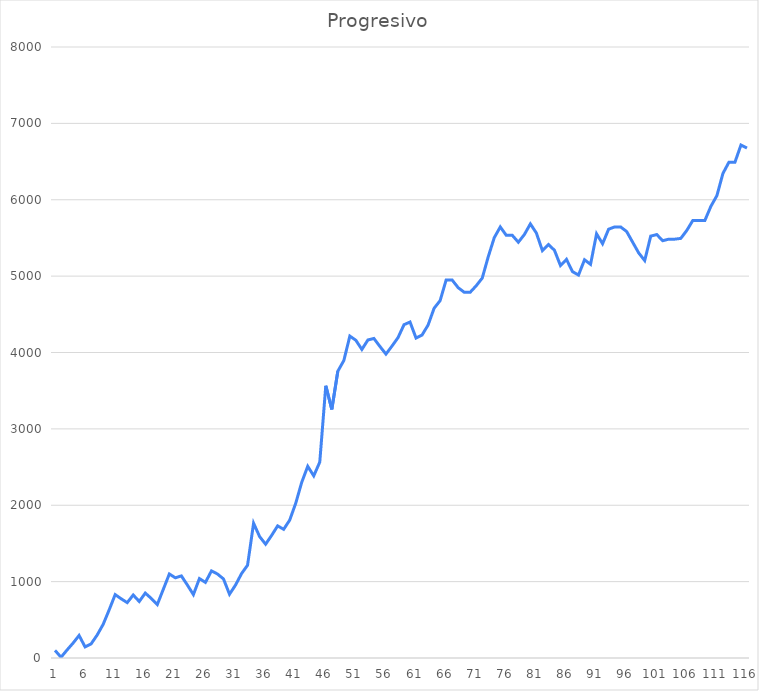
| Category | Series 0 |
|---|---|
| 0 | 100 |
| 1 | 10 |
| 2 | 105 |
| 3 | 195 |
| 4 | 295 |
| 5 | 145 |
| 6 | 185 |
| 7 | 300 |
| 8 | 440 |
| 9 | 630 |
| 10 | 830 |
| 11 | 775 |
| 12 | 725 |
| 13 | 825 |
| 14 | 740 |
| 15 | 850 |
| 16 | 780 |
| 17 | 700 |
| 18 | 900 |
| 19 | 1100 |
| 20 | 1050 |
| 21 | 1075 |
| 22 | 955 |
| 23 | 830 |
| 24 | 1040 |
| 25 | 990 |
| 26 | 1140 |
| 27 | 1100 |
| 28 | 1035 |
| 29 | 835 |
| 30 | 955 |
| 31 | 1105 |
| 32 | 1215 |
| 33 | 1765 |
| 34 | 1590 |
| 35 | 1490 |
| 36 | 1605 |
| 37 | 1730 |
| 38 | 1685 |
| 39 | 1805 |
| 40 | 2025 |
| 41 | 2300 |
| 42 | 2510 |
| 43 | 2385 |
| 44 | 2565 |
| 45 | 3565 |
| 46 | 3255 |
| 47 | 3755 |
| 48 | 3895 |
| 49 | 4215 |
| 50 | 4160 |
| 51 | 4040 |
| 52 | 4164 |
| 53 | 4184 |
| 54 | 4079 |
| 55 | 3979 |
| 56 | 4084 |
| 57 | 4194 |
| 58 | 4364 |
| 59 | 4399 |
| 60 | 4189 |
| 61 | 4229 |
| 62 | 4359 |
| 63 | 4579 |
| 64 | 4679 |
| 65 | 4949 |
| 66 | 4949 |
| 67 | 4849 |
| 68 | 4789 |
| 69 | 4789 |
| 70 | 4874 |
| 71 | 4974 |
| 72 | 5254 |
| 73 | 5504 |
| 74 | 5644 |
| 75 | 5534 |
| 76 | 5534 |
| 77 | 5444 |
| 78 | 5544 |
| 79 | 5684 |
| 80 | 5564 |
| 81 | 5334 |
| 82 | 5414 |
| 83 | 5339 |
| 84 | 5139 |
| 85 | 5219 |
| 86 | 5059 |
| 87 | 5014 |
| 88 | 5214 |
| 89 | 5154 |
| 90 | 5554 |
| 91 | 5424 |
| 92 | 5614 |
| 93 | 5644 |
| 94 | 5644 |
| 95 | 5584 |
| 96 | 5444 |
| 97 | 5304 |
| 98 | 5204 |
| 99 | 5524 |
| 100 | 5544 |
| 101 | 5464 |
| 102 | 5484 |
| 103 | 5484 |
| 104 | 5494 |
| 105 | 5599 |
| 106 | 5729 |
| 107 | 5729 |
| 108 | 5729 |
| 109 | 5914 |
| 110 | 6054 |
| 111 | 6344 |
| 112 | 6492 |
| 113 | 6492 |
| 114 | 6717 |
| 115 | 6677 |